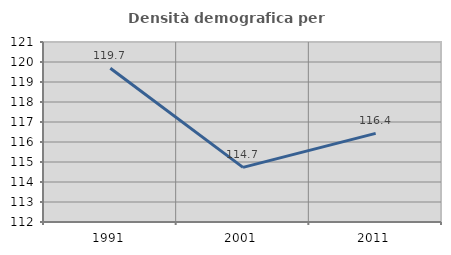
| Category | Densità demografica |
|---|---|
| 1991.0 | 119.686 |
| 2001.0 | 114.732 |
| 2011.0 | 116.431 |